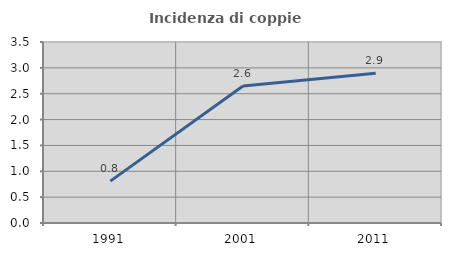
| Category | Incidenza di coppie miste |
|---|---|
| 1991.0 | 0.81 |
| 2001.0 | 2.647 |
| 2011.0 | 2.897 |